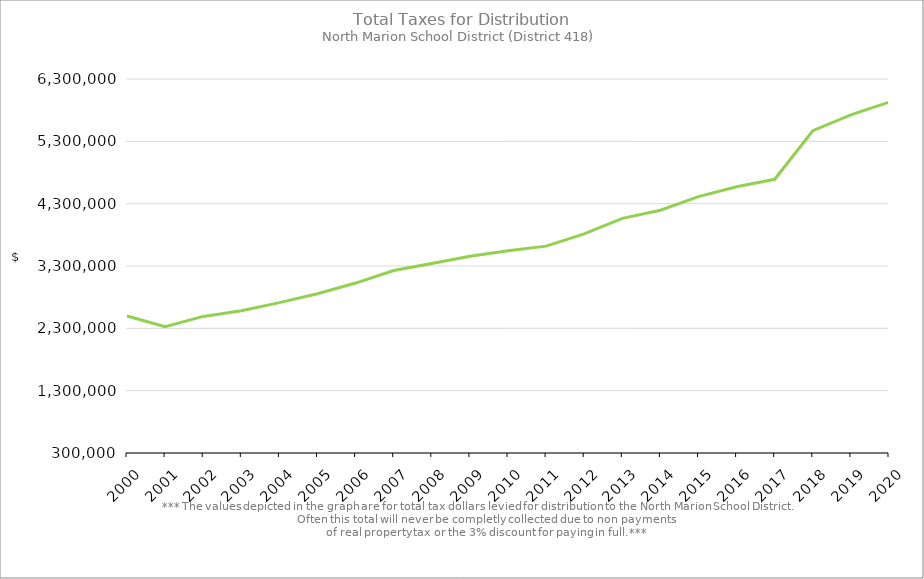
| Category | Series 0 |
|---|---|
| 2000.0 | 2497071.04 |
| 2001.0 | 2327278.31 |
| 2002.0 | 2491049.95 |
| 2003.0 | 2580937.12 |
| 2004.0 | 2712959.4 |
| 2005.0 | 2853843.24 |
| 2006.0 | 3026428.5 |
| 2007.0 | 3226777.58 |
| 2008.0 | 3339131.49 |
| 2009.0 | 3455387.3 |
| 2010.0 | 3543288.17 |
| 2011.0 | 3618475.73 |
| 2012.0 | 3816063.76 |
| 2013.0 | 4064680.62 |
| 2014.0 | 4195127.66 |
| 2015.0 | 4412187.22 |
| 2016.0 | 4571889.24 |
| 2017.0 | 4691164.96 |
| 2018.0 | 5470521.94 |
| 2019.0 | 5725155.2 |
| 2020.0 | 5928925.02 |